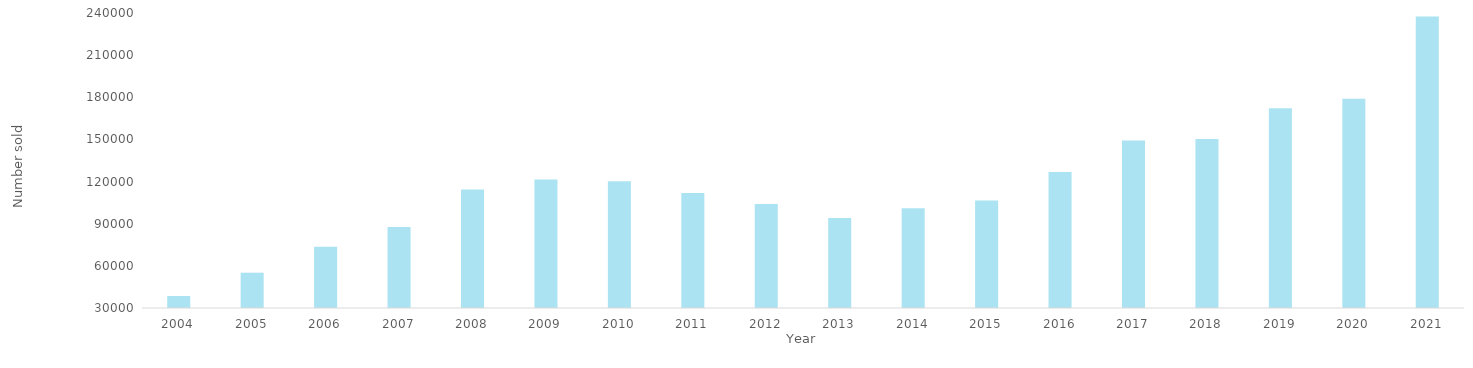
| Category | Series 0 |
|---|---|
| 2004.0 | 38538 |
| 2005.0 | 55128 |
| 2006.0 | 73648 |
| 2007.0 | 87574 |
| 2008.0 | 114336 |
| 2009.0 | 121420 |
| 2010.0 | 120180 |
| 2011.0 | 111887 |
| 2012.0 | 103971 |
| 2013.0 | 94083 |
| 2014.0 | 100964 |
| 2015.0 | 106437 |
| 2016.0 | 126760 |
| 2017.0 | 149326 |
| 2018.0 | 150256 |
| 2019.0 | 172230 |
| 2020.0 | 178997 |
| 2021.0 | 237569 |